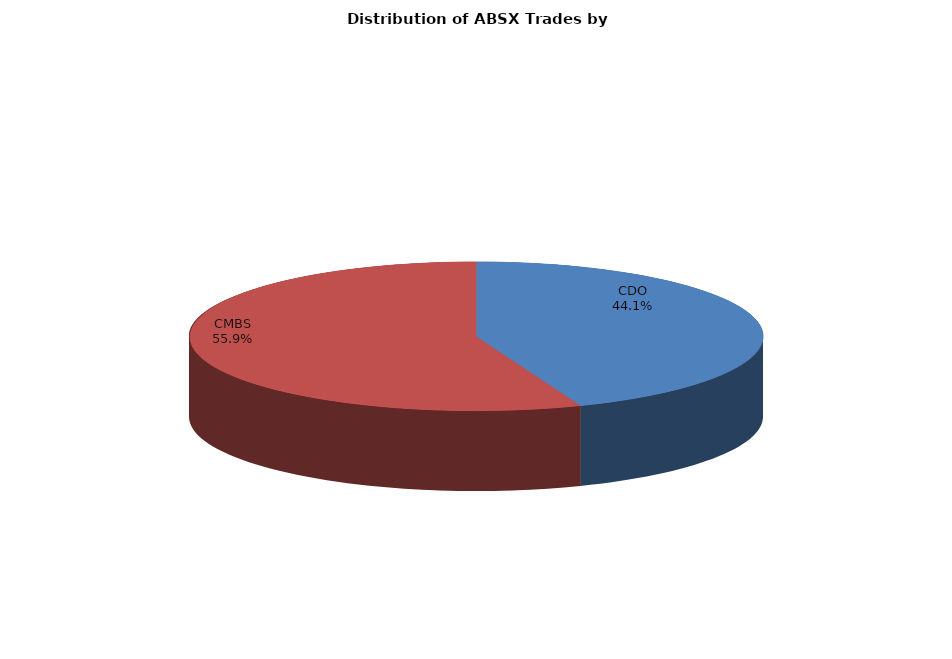
| Category | Series 0 |
|---|---|
| CDO | 179.171 |
| CMBS | 227.333 |